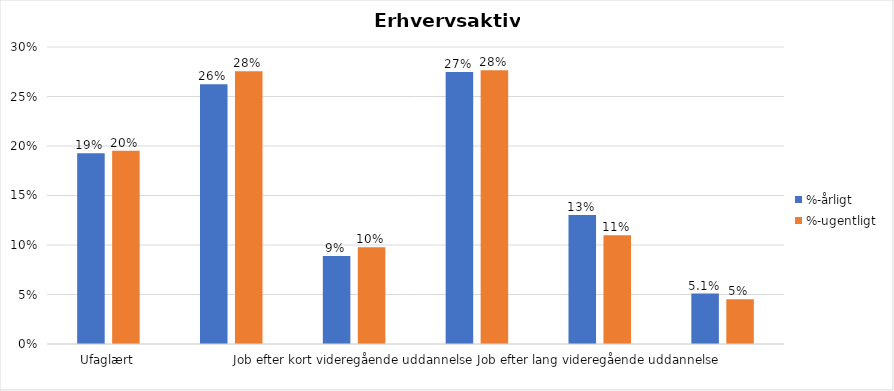
| Category | %-årligt | %-ugentligt |
|---|---|---|
| Ufaglært | 0.193 | 0.195 |
| Erhvervsfagligt job | 0.262 | 0.275 |
| Job efter kort videregående uddannelse | 0.089 | 0.098 |
| Job efter mellemlang videregående uddannelse | 0.275 | 0.276 |
| Job efter lang videregående uddannelse | 0.13 | 0.11 |
| Selvstændig | 0.051 | 0.045 |